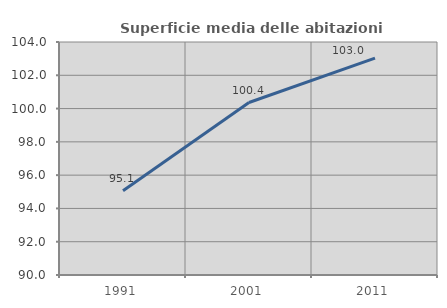
| Category | Superficie media delle abitazioni occupate |
|---|---|
| 1991.0 | 95.068 |
| 2001.0 | 100.363 |
| 2011.0 | 103.026 |